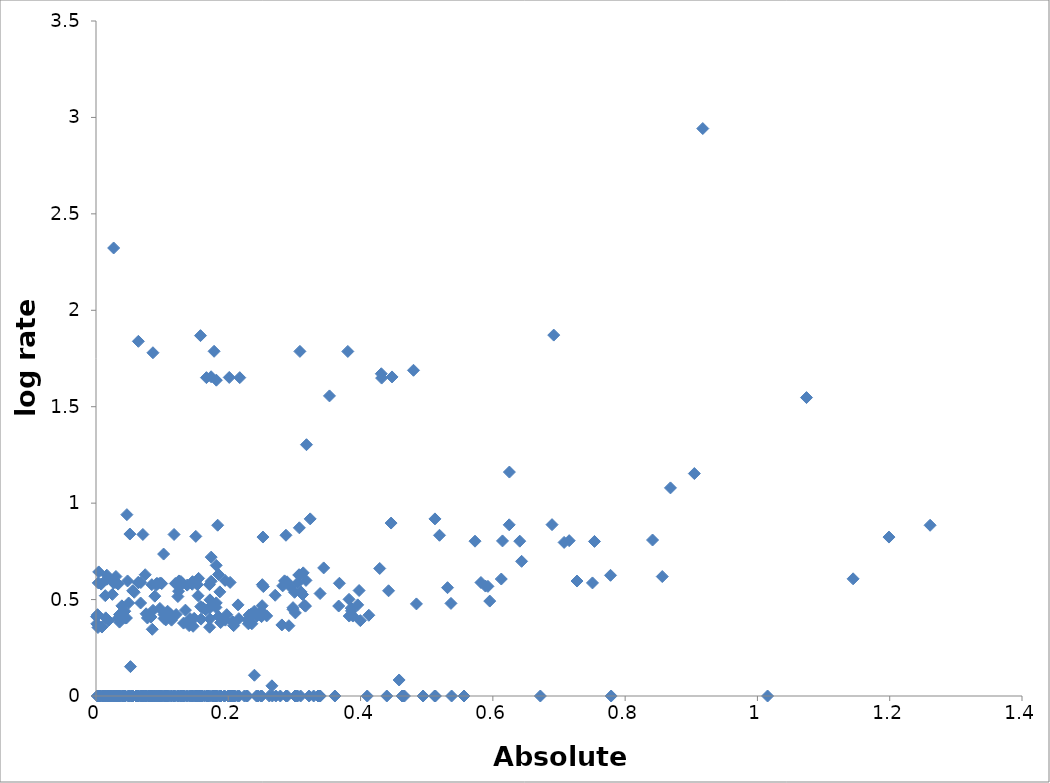
| Category | Series 0 |
|---|---|
| 1.26105212528628 | 0.885 |
| 1.19889773001511 | 0.824 |
| 1.14464294422525 | 0.608 |
| 1.07419693452198 | 1.547 |
| 1.01532346103177 | 0 |
| 0.917386125813748 | 2.942 |
| 0.904636406466177 | 1.153 |
| 0.868514509960926 | 1.079 |
| 0.85614270064849 | 0.619 |
| 0.841416015242298 | 0.809 |
| 0.77883136043544 | 0 |
| 0.777895882047736 | 0.626 |
| 0.753634941804913 | 0.801 |
| 0.750621270961887 | 0.586 |
| 0.727220919420654 | 0.596 |
| 0.71537704507373 | 0.805 |
| 0.707747121616219 | 0.796 |
| 0.6920617453364 | 1.871 |
| 0.689465387237684 | 0.888 |
| 0.671811806176501 | 0 |
| 0.643447466457245 | 0.698 |
| 0.640669381168109 | 0.803 |
| 0.624999752471749 | 1.161 |
| 0.624736480437494 | 0.888 |
| 0.614579511205027 | 0.804 |
| 0.612733675305981 | 0.607 |
| 0.595320552069427 | 0.492 |
| 0.592519317366768 | 0.569 |
| 0.588809143089531 | 0.57 |
| 0.582034454729521 | 0.588 |
| 0.573010494867713 | 0.803 |
| 0.556363043356876 | 0 |
| 0.537638406104888 | 0 |
| 0.536658952388394 | 0.48 |
| 0.531499906515163 | 0.562 |
| 0.519336375028552 | 0.833 |
| 0.513185151101106 | 0 |
| 0.512442688203035 | 0.918 |
| 0.512038051085298 | 0 |
| 0.494456397241747 | 0 |
| 0.484425527759492 | 0.478 |
| 0.479999836743396 | 1.689 |
| 0.46631448592081 | 0 |
| 0.46445869234047 | 0 |
| 0.462799915721881 | 0 |
| 0.458288228018308 | 0.083 |
| 0.447554479617573 | 1.654 |
| 0.446135740709713 | 0.897 |
| 0.442318551752012 | 0.546 |
| 0.439648543105183 | 0 |
| 0.431832567411592 | 1.649 |
| 0.43132888500569 | 1.671 |
| 0.428959909901442 | 0.661 |
| 0.41245646564718 | 0.419 |
| 0.410093713833068 | 0 |
| 0.399676100640619 | 0.391 |
| 0.397775660277181 | 0.547 |
| 0.395641726618898 | 0.472 |
| 0.388333194704145 | 0.415 |
| 0.386268134515145 | 0.441 |
| 0.385845889138991 | 0.455 |
| 0.382815192763361 | 0.415 |
| 0.382581886817531 | 0.501 |
| 0.380707053737482 | 1.787 |
| 0.368014110162362 | 0.585 |
| 0.366950760706781 | 0.467 |
| 0.361244374367053 | 0 |
| 0.352987597116693 | 1.556 |
| 0.344230820303753 | 0.664 |
| 0.339054412625511 | 0 |
| 0.338797148450941 | 0.531 |
| 0.33828066556272 | 0 |
| 0.337024455629376 | 0 |
| 0.336262086279973 | 0 |
| 0.336213618954323 | 0 |
| 0.335697449903267 | 0 |
| 0.329121096475579 | 0 |
| 0.323814377595364 | 0.918 |
| 0.322173912398519 | 0 |
| 0.31820937428641 | 1.303 |
| 0.317420324346253 | 0.599 |
| 0.316725079209827 | 0.466 |
| 0.315170088469438 | 0.471 |
| 0.313306557213584 | 0.639 |
| 0.312251579417574 | 0.526 |
| 0.309867071625499 | 0.54 |
| 0.309346057140487 | 0 |
| 0.308249630101891 | 1.787 |
| 0.307447861812326 | 0.872 |
| 0.307011439312094 | 0.626 |
| 0.307011439312094 | 0.629 |
| 0.304981392027849 | 0.586 |
| 0.304761045605537 | 0 |
| 0.30318178065074 | 0 |
| 0.301391376039719 | 0.431 |
| 0.300873801022308 | 0 |
| 0.300179174726332 | 0.538 |
| 0.297909194522558 | 0.458 |
| 0.29782004985396 | 0.45 |
| 0.293684668545044 | 0.567 |
| 0.291653899378489 | 0.364 |
| 0.289284558093192 | 0 |
| 0.288842314137567 | 0.592 |
| 0.287389746953814 | 0 |
| 0.287218587889834 | 0.833 |
| 0.285110846811056 | 0.597 |
| 0.282267812570886 | 0.571 |
| 0.281013568559204 | 0.368 |
| 0.278597686854553 | 0 |
| 0.271899141772559 | 0 |
| 0.270887422885879 | 0.522 |
| 0.266563023547937 | 0 |
| 0.265958161696443 | 0.053 |
| 0.261985872206714 | 0 |
| 0.258038679008973 | 0.415 |
| 0.252996676955716 | 0.567 |
| 0.252402603861531 | 0.824 |
| 0.251424397755203 | 0.577 |
| 0.251180392020951 | 0.468 |
| 0.250640709062438 | 0 |
| 0.250321920541764 | 0.412 |
| 0.250122593771818 | 0.44 |
| 0.249204006141458 | 0 |
| 0.247195722224625 | 0.424 |
| 0.24513328853006 | 0 |
| 0.243994591435936 | 0 |
| 0.242920271546669 | 0.414 |
| 0.242616640488892 | 0 |
| 0.239525261705914 | 0.108 |
| 0.239184981174997 | 0.439 |
| 0.235621078115772 | 0.375 |
| 0.234628118605386 | 0.412 |
| 0.234381360807299 | 0.424 |
| 0.2315189155611 | 0.42 |
| 0.230409249973166 | 0.374 |
| 0.228995308278183 | 0.394 |
| 0.228987258855573 | 0 |
| 0.227632213151347 | 0 |
| 0.227580311063711 | 0 |
| 0.224357127902584 | 0 |
| 0.217351607587174 | 1.651 |
| 0.21649425854113 | 0 |
| 0.215985278579087 | 0.401 |
| 0.214749015319828 | 0.473 |
| 0.213969979948771 | 0 |
| 0.209937418233106 | 0 |
| 0.208845859654929 | 0 |
| 0.208055781127555 | 0.365 |
| 0.207322928691964 | 0 |
| 0.206497543544476 | 0.386 |
| 0.206188336470387 | 0 |
| 0.205262908440442 | 0 |
| 0.204182713894131 | 0 |
| 0.203824028276465 | 0 |
| 0.203099006400284 | 0 |
| 0.202758928868983 | 0.589 |
| 0.202542504458956 | 0 |
| 0.201472582358862 | 1.652 |
| 0.201099067332615 | 0 |
| 0.199679326478306 | 0 |
| 0.197660642991663 | 0.422 |
| 0.195580918153338 | 0.393 |
| 0.195181079803055 | 0.599 |
| 0.194604986328572 | 0 |
| 0.193884827415217 | 0 |
| 0.189015920476561 | 0 |
| 0.188452700962416 | 0.381 |
| 0.187982083860782 | 0 |
| 0.187274432182585 | 0.54 |
| 0.186459391177113 | 0 |
| 0.185288966747328 | 0.412 |
| 0.185224830254194 | 0.63 |
| 0.183964221020604 | 0.886 |
| 0.183285447466259 | 0 |
| 0.181978409696525 | 0 |
| 0.181947900311446 | 1.638 |
| 0.181804248296869 | 0.483 |
| 0.18169625639221 | 0.678 |
| 0.181445975569493 | 0 |
| 0.181325150760226 | 0.459 |
| 0.178534501872042 | 1.787 |
| 0.178397210225258 | 0 |
| 0.177836590006179 | 0 |
| 0.176473524510258 | 0 |
| 0.175787190884922 | 0 |
| 0.175541217722572 | 0.471 |
| 0.174162824444658 | 0.595 |
| 0.174162824444658 | 0.72 |
| 0.174044292814839 | 1.655 |
| 0.172261832062061 | 0.499 |
| 0.172138813491917 | 0.4 |
| 0.172099559911016 | 0 |
| 0.17176385081011 | 0.357 |
| 0.171736274015621 | 0.456 |
| 0.171493538922417 | 0.577 |
| 0.169236576501541 | 0 |
| 0.169049009233744 | 0 |
| 0.168222577147371 | 0 |
| 0.167768365390675 | 0 |
| 0.167336758268939 | 0 |
| 0.166962167091991 | 1.651 |
| 0.166011102814497 | 0.447 |
| 0.164067317900583 | 0 |
| 0.161562794572169 | 0.458 |
| 0.160825960849103 | 0 |
| 0.160130621094301 | 0 |
| 0.158792324334406 | 0.399 |
| 0.158308446137299 | 0.464 |
| 0.158151976833337 | 0 |
| 0.157989140312302 | 1.869 |
| 0.157228752729067 | 0 |
| 0.156203776532363 | 0 |
| 0.155128838239411 | 0.61 |
| 0.154897813552393 | 0 |
| 0.154327401329935 | 0.52 |
| 0.153277975129413 | 0 |
| 0.15327471345314 | 0.577 |
| 0.152600173084538 | 0 |
| 0.152246195015233 | 0 |
| 0.15119078076464 | 0 |
| 0.150881676129163 | 0.828 |
| 0.150835644443988 | 0 |
| 0.149859196448769 | 0 |
| 0.148434550677736 | 0.403 |
| 0.147287296633825 | 0 |
| 0.146790446114702 | 0.361 |
| 0.14590115742457 | 0.593 |
| 0.145628510805884 | 0 |
| 0.145480266882396 | 0.58 |
| 0.145432447412472 | 0 |
| 0.142975620843653 | 0 |
| 0.142077585434108 | 0.401 |
| 0.141593601156318 | 0 |
| 0.140803925054742 | 0.365 |
| 0.138522254112892 | 0 |
| 0.137832592085079 | 0.575 |
| 0.136596133225261 | 0 |
| 0.135165886096747 | 0.445 |
| 0.13332194998483 | 0 |
| 0.13256025824557 | 0 |
| 0.132346903847662 | 0.378 |
| 0.131422715134759 | 0 |
| 0.130920180256412 | 0.583 |
| 0.129202396733248 | 0 |
| 0.128660121573722 | 0 |
| 0.128318342281891 | 0.594 |
| 0.127927225483282 | 0 |
| 0.127571720128452 | 0 |
| 0.125399372823004 | 0.597 |
| 0.124800048599135 | 0.543 |
| 0.124773563401566 | 0 |
| 0.123821081999191 | 0.516 |
| 0.123724345695543 | 0 |
| 0.123301701373637 | 0 |
| 0.121248798954154 | 0.423 |
| 0.119946312195853 | 0 |
| 0.119900243321446 | 0.583 |
| 0.117987931793528 | 0.838 |
| 0.117731326816464 | 0 |
| 0.117628211879945 | 0 |
| 0.116180468050527 | 0.409 |
| 0.114289859092327 | 0 |
| 0.114185035344762 | 0.393 |
| 0.113935310980644 | 0 |
| 0.112176274560763 | 0.426 |
| 0.111163764551563 | 0 |
| 0.108804557047918 | 0 |
| 0.108194614632078 | 0.44 |
| 0.107959308010715 | 0.414 |
| 0.107236353350774 | 0 |
| 0.105690500010803 | 0 |
| 0.105518115705812 | 0.394 |
| 0.104599255951338 | 0 |
| 0.104590295375785 | 0 |
| 0.102856508133937 | 0.422 |
| 0.102846673202177 | 0.402 |
| 0.102578893919547 | 0 |
| 0.10222125295958 | 0.736 |
| 0.100063659437407 | 0 |
| 0.0993441850157119 | 0.583 |
| 0.0990045226520676 | 0 |
| 0.0974209177891695 | 0 |
| 0.0973248383840546 | 0.586 |
| 0.0965769896214819 | 0.454 |
| 0.0964599135873919 | 0 |
| 0.0954431678184961 | 0 |
| 0.0939510265715099 | 0 |
| 0.0932974639146219 | 0.583 |
| 0.0919072002393585 | 0 |
| 0.0915754039598736 | 0.583 |
| 0.0912830144381655 | 0 |
| 0.0912676158997509 | 0.575 |
| 0.0890418649990525 | 0 |
| 0.0889448070467917 | 0.518 |
| 0.0881387108653541 | 0 |
| 0.0872526644300313 | 0 |
| 0.0862215931171841 | 0.444 |
| 0.0861281804795332 | 1.78 |
| 0.0850315380314738 | 0.346 |
| 0.084695918794951 | 0 |
| 0.0844734757768716 | 0 |
| 0.0844188544315361 | 0 |
| 0.084407684624606 | 0.577 |
| 0.0837844123475391 | 0 |
| 0.0831362162070411 | 0.409 |
| 0.0825881134697762 | 0 |
| 0.0818656775852542 | 0 |
| 0.0809512949891932 | 0 |
| 0.0796122043416025 | 0 |
| 0.0793780180696854 | 0 |
| 0.0792865787969875 | 0 |
| 0.0777369375539121 | 0.405 |
| 0.0760955088843805 | 0 |
| 0.0757791637827454 | 0.426 |
| 0.0755907252244415 | 0 |
| 0.0746877116561961 | 0 |
| 0.0743866897484567 | 0.629 |
| 0.0738259157505895 | 0 |
| 0.0715477930058745 | 0 |
| 0.0708504348591228 | 0.838 |
| 0.0708181800335172 | 0 |
| 0.070390285653295 | 0 |
| 0.0698751323781452 | 0 |
| 0.0697718800947183 | 0 |
| 0.0693833236169928 | 0 |
| 0.06918510914334 | 0 |
| 0.0685957332459405 | 0 |
| 0.067769178772188 | 0.588 |
| 0.0674513994229131 | 0.482 |
| 0.0670127223925979 | 0 |
| 0.064078364698981 | 0 |
| 0.0640645413336002 | 1.839 |
| 0.0640587998320469 | 0.59 |
| 0.0640587998320469 | 0.587 |
| 0.0639957350494261 | 0 |
| 0.0634890769697294 | 0 |
| 0.0627763008456923 | 0 |
| 0.0625545926771858 | 0 |
| 0.0617229969192475 | 0 |
| 0.0613141889593271 | 0 |
| 0.0604844099539945 | 0 |
| 0.0578027284843984 | 0.538 |
| 0.0559155559502611 | 0 |
| 0.0558452846929369 | 0 |
| 0.0555683364185849 | 0 |
| 0.0554713076805062 | 0.546 |
| 0.054819132890685 | 0 |
| 0.0546153483323465 | 0 |
| 0.0545389713154991 | 0 |
| 0.0520762468950753 | 0.152 |
| 0.0517091317270408 | 0 |
| 0.0512239552959492 | 0.84 |
| 0.0501576333489146 | 0 |
| 0.0497285955054686 | 0 |
| 0.0494360445902557 | 0.482 |
| 0.0491578324430022 | 0 |
| 0.0489357217670061 | 0 |
| 0.0476859251716986 | 0.596 |
| 0.0466799825949875 | 0.94 |
| 0.0460582460298383 | 0.404 |
| 0.0445423945218432 | 0 |
| 0.0444360010313941 | 0.404 |
| 0.0438100355672645 | 0 |
| 0.0435071396655387 | 0 |
| 0.0434785467983098 | 0.439 |
| 0.0421027333656011 | 0 |
| 0.0411009483348246 | 0 |
| 0.0408577762686217 | 0 |
| 0.0397812422091676 | 0 |
| 0.0391355220080483 | 0.467 |
| 0.0374012697625627 | 0 |
| 0.0361845836530357 | 0.402 |
| 0.035666500001427 | 0 |
| 0.0355635167424939 | 0.422 |
| 0.0355520250945764 | 0.383 |
| 0.0349022708386137 | 0 |
| 0.0343942911931669 | 0 |
| 0.034392195006896 | 0 |
| 0.0342284469241912 | 0.404 |
| 0.0339717514436052 | 0.404 |
| 0.0335986308116626 | 0 |
| 0.0334161062158687 | 0.58 |
| 0.0320371552649952 | 0 |
| 0.0314966935642447 | 0 |
| 0.0306771313269107 | 0 |
| 0.0301901016311108 | 0.62 |
| 0.030162419384111 | 0.588 |
| 0.0293814346065579 | 0 |
| 0.0293060809549823 | 0 |
| 0.0282153152069102 | 0 |
| 0.0267290893374505 | 0 |
| 0.0267171361561925 | 2.323 |
| 0.0266676698133025 | 0.589 |
| 0.0266676698133025 | 0.586 |
| 0.0266676698133025 | 0.598 |
| 0.0254920863638044 | 0 |
| 0.0247335048096636 | 0.527 |
| 0.0236066324069237 | 0 |
| 0.0224867155719866 | 0 |
| 0.0205933141469462 | 0 |
| 0.0205089998449002 | 0 |
| 0.0187755892188348 | 0.391 |
| 0.0181668787248577 | 0 |
| 0.0179800719467546 | 0 |
| 0.0176234342110625 | 0 |
| 0.0163903286822716 | 0.605 |
| 0.0163903286822716 | 0.626 |
| 0.0147718320098174 | 0 |
| 0.0147584791514361 | 0.405 |
| 0.0147580991706214 | 0 |
| 0.0140701617864422 | 0 |
| 0.0140494780673983 | 0.52 |
| 0.0140322916746615 | 0 |
| 0.0119144037149225 | 0 |
| 0.0111445898463865 | 0 |
| 0.0108975235549795 | 0 |
| 0.0103980988169812 | 0 |
| 0.00901092476021649 | 0.358 |
| 0.00839922635779091 | 0 |
| 0.00775826827545884 | 0.58 |
| 0.00638600700219776 | 0 |
| 0.00542896618772134 | 0 |
| 0.00493503566547332 | 0 |
| 0.00493399912899122 | 0 |
| 0.00466524748304431 | 0 |
| 0.00415457836667142 | 0 |
| 0.00410658418585376 | 0.643 |
| 0.00337960567359045 | 0.586 |
| 0.00297808552156522 | 0.355 |
| 0.00235783087085661 | 0.422 |
| 0.00228173284929868 | 0 |
| 0.00192587520638591 | 0 |
| 0.00117327674767503 | 0.374 |
| 0.000754270419928548 | 0.412 |